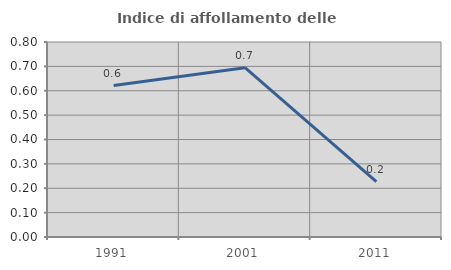
| Category | Indice di affollamento delle abitazioni  |
|---|---|
| 1991.0 | 0.621 |
| 2001.0 | 0.694 |
| 2011.0 | 0.227 |